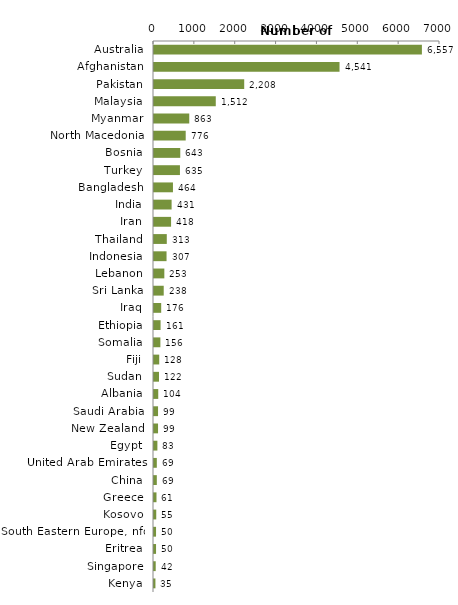
| Category | Series 0 |
|---|---|
| Australia | 6557 |
| Afghanistan | 4541 |
| Pakistan | 2208 |
| Malaysia | 1512 |
| Myanmar | 863 |
| North Macedonia | 776 |
| Bosnia | 643 |
| Turkey | 635 |
| Bangladesh | 464 |
| India | 431 |
| Iran | 418 |
| Thailand | 313 |
| Indonesia | 307 |
| Lebanon | 253 |
| Sri Lanka | 238 |
| Iraq | 176 |
| Ethiopia | 161 |
| Somalia | 156 |
| Fiji | 128 |
| Sudan | 122 |
| Albania | 104 |
| Saudi Arabia | 99 |
| New Zealand | 99 |
| Egypt | 83 |
| United Arab Emirates | 69 |
| China | 69 |
| Greece | 61 |
| Kosovo | 55 |
| South Eastern Europe, nfd | 50 |
| Eritrea | 50 |
| Singapore | 42 |
| Kenya | 35 |